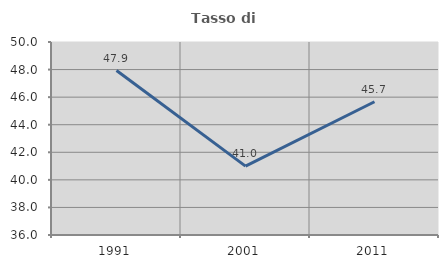
| Category | Tasso di occupazione   |
|---|---|
| 1991.0 | 47.927 |
| 2001.0 | 40.997 |
| 2011.0 | 45.667 |